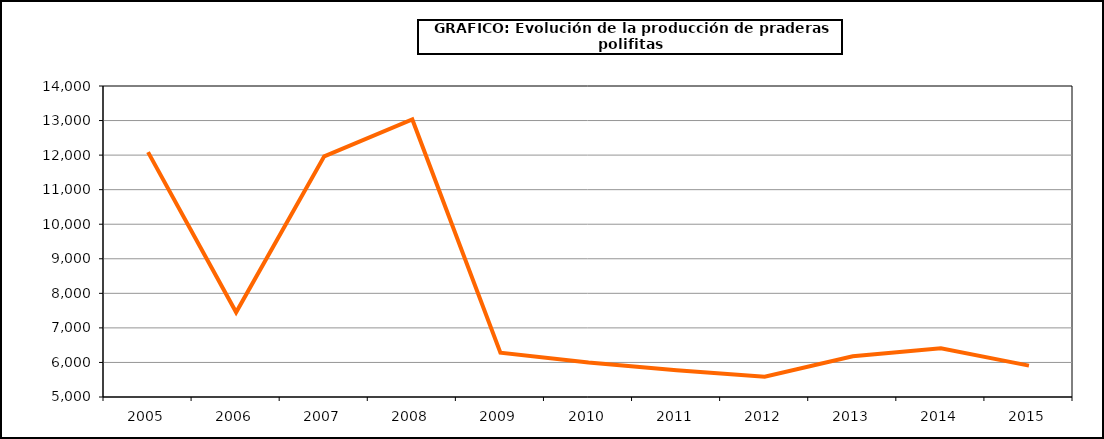
| Category | Producción |
|---|---|
| 2005.0 | 12085.45 |
| 2006.0 | 7451.635 |
| 2007.0 | 11965.253 |
| 2008.0 | 13031.127 |
| 2009.0 | 6281.816 |
| 2010.0 | 5997.652 |
| 2011.0 | 5773.366 |
| 2012.0 | 5584.28 |
| 2013.0 | 6180.164 |
| 2014.0 | 6413.135 |
| 2015.0 | 5907.876 |